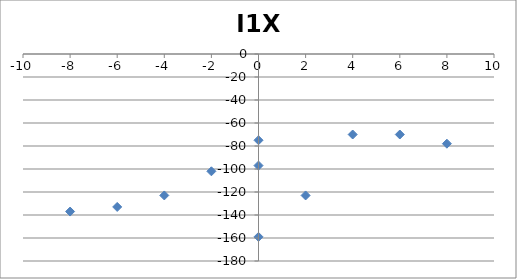
| Category | I1X |
|---|---|
| 0.0 | -159 |
| 2.0 | -123 |
| 4.0 | -70 |
| 6.0 | -70 |
| 8.0 | -78 |
| 0.0 | -97 |
| -2.0 | -102 |
| -4.0 | -123 |
| -6.0 | -133 |
| -8.0 | -137 |
| 0.0 | -75 |